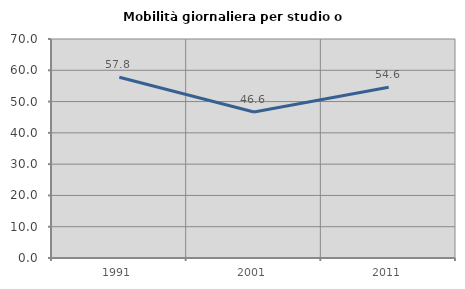
| Category | Mobilità giornaliera per studio o lavoro |
|---|---|
| 1991.0 | 57.759 |
| 2001.0 | 46.649 |
| 2011.0 | 54.573 |